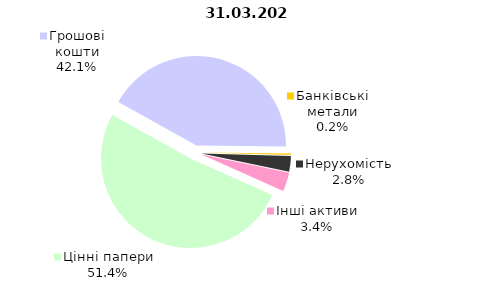
| Category | 31.03.2020 |
|---|---|
| Цінні папери | 1597.5 |
| Грошові кошти | 1307.5 |
| Банківські метали | 7.6 |
| Нерухомість | 88.5 |
| Інші активи | 105.4 |